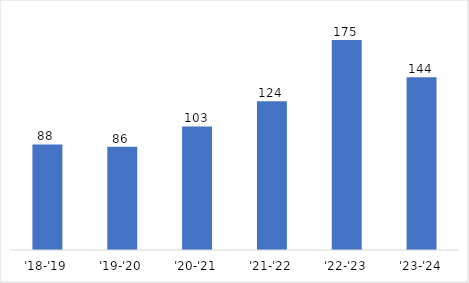
| Category | New Student |
|---|---|
| '18-'19 | 88 |
| '19-'20 | 86 |
| '20-'21 | 103 |
| '21-'22 | 124 |
| '22-'23 | 175 |
| '23-'24 | 144 |